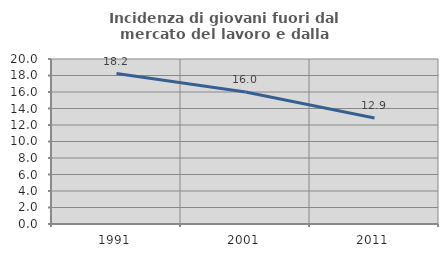
| Category | Incidenza di giovani fuori dal mercato del lavoro e dalla formazione  |
|---|---|
| 1991.0 | 18.237 |
| 2001.0 | 16 |
| 2011.0 | 12.854 |